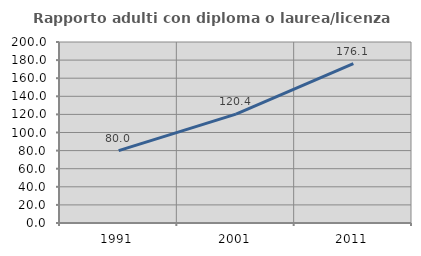
| Category | Rapporto adulti con diploma o laurea/licenza media  |
|---|---|
| 1991.0 | 79.967 |
| 2001.0 | 120.353 |
| 2011.0 | 176.056 |